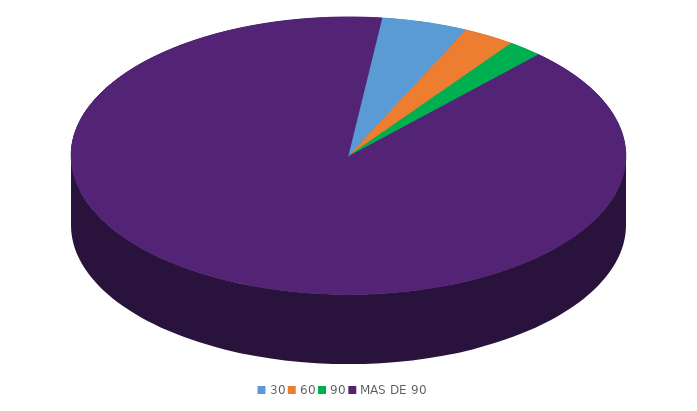
| Category | Series 0 |
|---|---|
| 30 | 1560708.7 |
| 60 | 936425.2 |
| 90 | 624283.5 |
| MAS DE 90 | 28092757.2 |